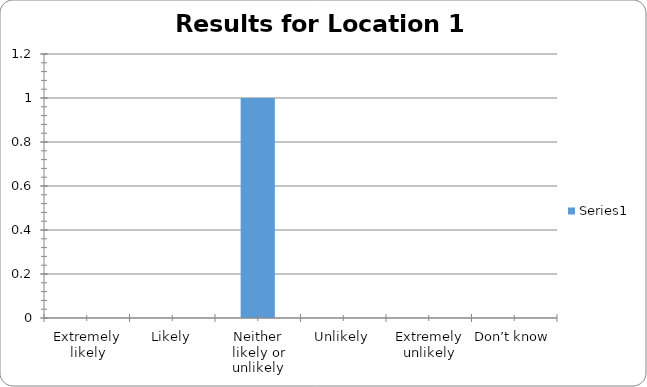
| Category | Series 0 |
|---|---|
| Extremely likely | 0 |
| Likely | 0 |
| Neither likely or unlikely | 1 |
| Unlikely | 0 |
| Extremely unlikely | 0 |
| Don’t know | 0 |